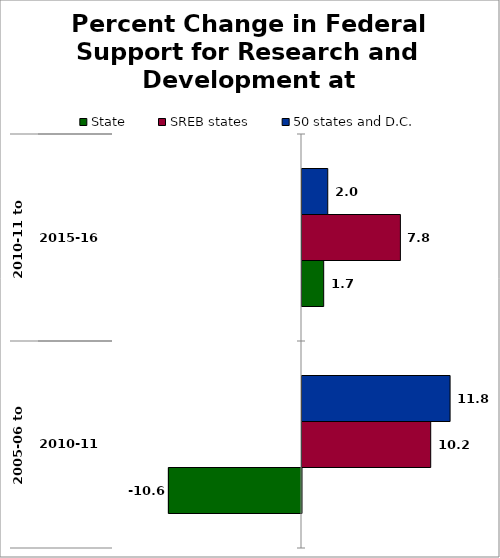
| Category | State | SREB states | 50 states and D.C. |
|---|---|---|---|
| 0 | -10.563 | 10.216 | 11.753 |
| 1 | 1.722 | 7.809 | 2.044 |